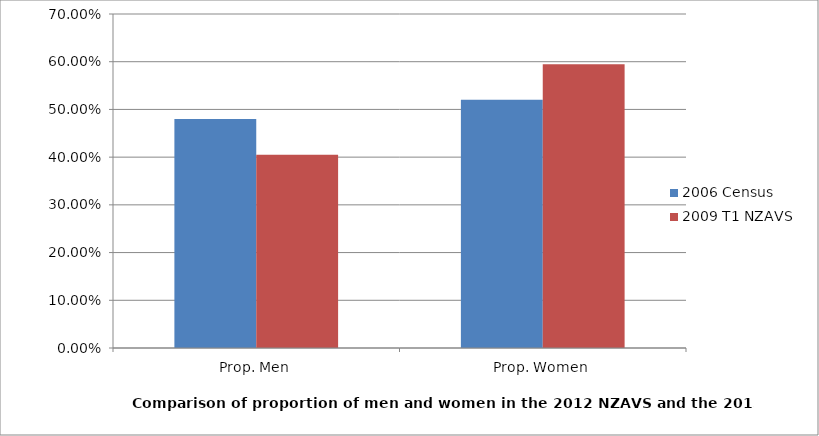
| Category | 2006 Census | 2009 T1 NZAVS |
|---|---|---|
| Prop. Men | 0.48 | 0.405 |
| Prop. Women | 0.52 | 0.595 |